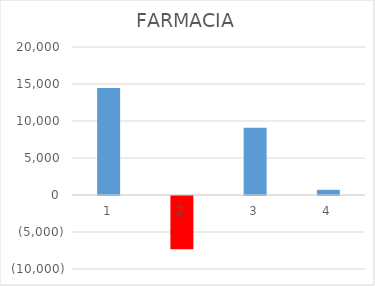
| Category | Series 0 |
|---|---|
| 0 | 14465.29 |
| 1 | -7190.407 |
| 2 | 9101.493 |
| 3 | 699.67 |